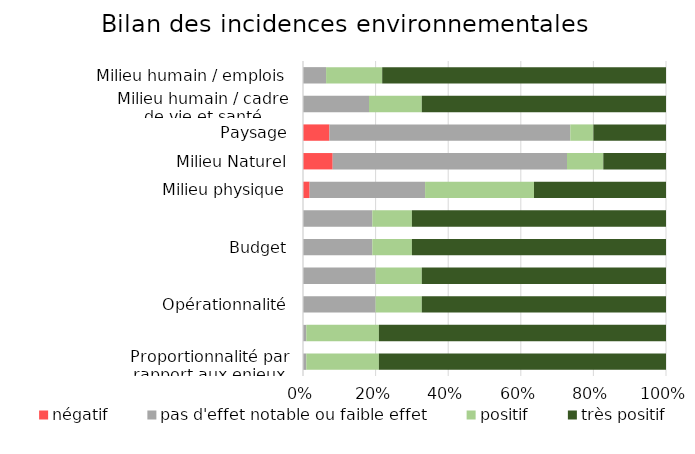
| Category | négatif | pas d'effet notable ou faible effet | positif | très positif |
|---|---|---|---|---|
| Proportionnalité par rapport aux enjeux | 0 | 1 | 22 | 87 |
|  | 0 | 0.009 | 0.2 | 0.791 |
| Opérationnalité | 0 | 22 | 14 | 74 |
|  | 0 | 0.2 | 0.127 | 0.673 |
| Budget | 0 | 21 | 12 | 77 |
|  | 0 | 0.191 | 0.109 | 0.7 |
| Milieu physique | 2 | 35 | 33 | 40 |
| Milieu Naturel | 9 | 71 | 11 | 19 |
| Paysage | 8 | 73 | 7 | 22 |
| Milieu humain / cadre de vie et santé | 0 | 20 | 16 | 74 |
| Milieu humain / emplois | 0 | 7 | 17 | 86 |